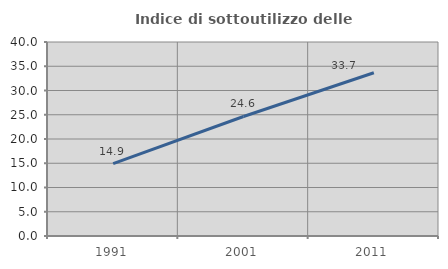
| Category | Indice di sottoutilizzo delle abitazioni  |
|---|---|
| 1991.0 | 14.906 |
| 2001.0 | 24.643 |
| 2011.0 | 33.657 |